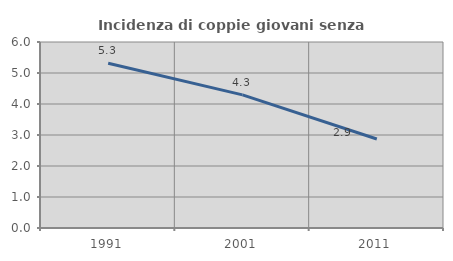
| Category | Incidenza di coppie giovani senza figli |
|---|---|
| 1991.0 | 5.314 |
| 2001.0 | 4.295 |
| 2011.0 | 2.871 |